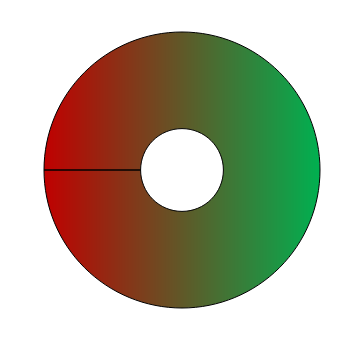
| Category | Series 0 |
|---|---|
| 0 | 140 |